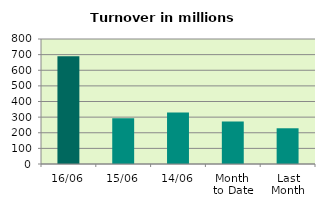
| Category | Series 0 |
|---|---|
| 16/06 | 689.072 |
| 15/06 | 292.853 |
| 14/06 | 329.052 |
| Month 
to Date | 271.393 |
| Last
Month | 228.645 |